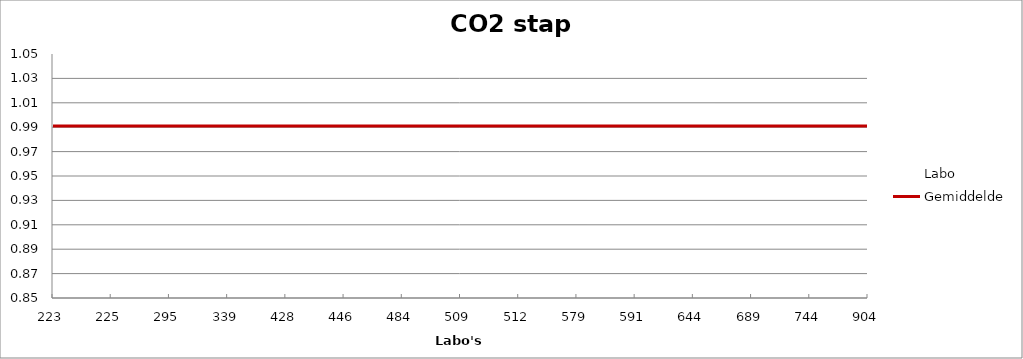
| Category | Labo | Gemiddelde |
|---|---|---|
| 223.0 | 0.976 | 0.991 |
| 225.0 | 0.991 | 0.991 |
| 295.0 | 0.988 | 0.991 |
| 339.0 | 1.037 | 0.991 |
| 428.0 | 0.99 | 0.991 |
| 446.0 | 0.996 | 0.991 |
| 484.0 | 0.892 | 0.991 |
| 509.0 | 1.001 | 0.991 |
| 512.0 | 0.954 | 0.991 |
| 579.0 | 0.983 | 0.991 |
| 591.0 | 0.991 | 0.991 |
| 644.0 | 1.047 | 0.991 |
| 689.0 | 1.006 | 0.991 |
| 744.0 | 0.951 | 0.991 |
| 904.0 | 1.018 | 0.991 |